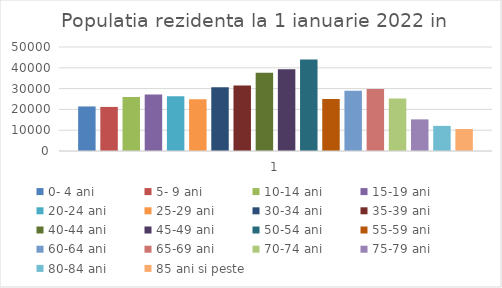
| Category | 0- 4 ani | 5- 9 ani | 10-14 ani | 15-19 ani | 20-24 ani | 25-29 ani | 30-34 ani | 35-39 ani | 40-44 ani | 45-49 ani | 50-54 ani | 55-59 ani | 60-64 ani | 65-69 ani | 70-74 ani | 75-79 ani | 80-84 ani | 85 ani si peste |
|---|---|---|---|---|---|---|---|---|---|---|---|---|---|---|---|---|---|---|
| 0 | 21420 | 21185 | 25938 | 27205 | 26379 | 24843 | 30675 | 31543 | 37656 | 39306 | 43931 | 25036 | 28917 | 29789 | 25260 | 15208 | 12092 | 10580 |